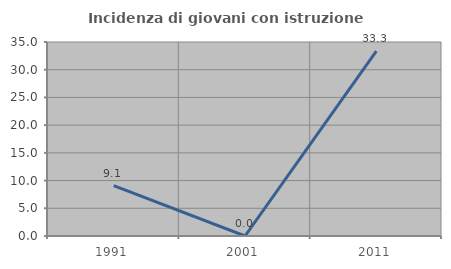
| Category | Incidenza di giovani con istruzione universitaria |
|---|---|
| 1991.0 | 9.091 |
| 2001.0 | 0 |
| 2011.0 | 33.333 |